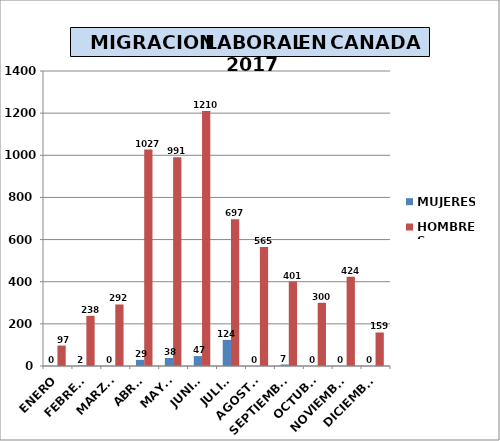
| Category | MUJERES | HOMBRES |
|---|---|---|
| ENERO | 0 | 97 |
| FEBRERO | 2 | 238 |
| MARZO | 0 | 292 |
| ABRIL | 29 | 1027 |
| MAYO | 38 | 991 |
| JUNIO | 47 | 1210 |
| JULIO | 124 | 697 |
| AGOSTO | 0 | 565 |
| SEPTIEMBRE | 7 | 401 |
| OCTUBRE | 0 | 300 |
| NOVIEMBRE | 0 | 424 |
| DICIEMBRE | 0 | 159 |